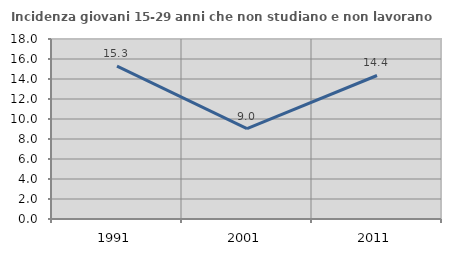
| Category | Incidenza giovani 15-29 anni che non studiano e non lavorano  |
|---|---|
| 1991.0 | 15.28 |
| 2001.0 | 9.036 |
| 2011.0 | 14.351 |